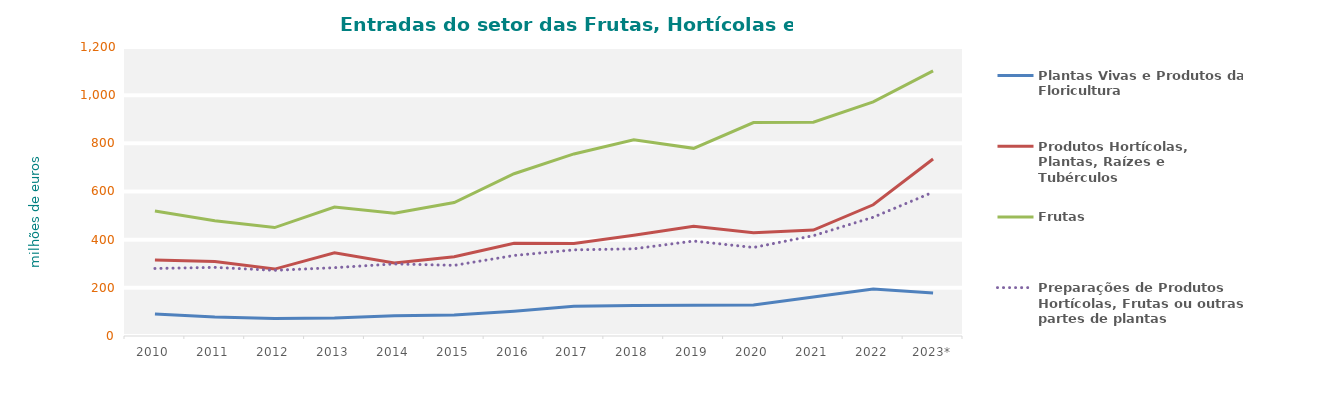
| Category | Plantas Vivas e Produtos da Floricultura | Produtos Hortícolas, Plantas, Raízes e Tubérculos  | Frutas | Preparações de Produtos Hortícolas, Frutas ou outras partes de plantas |
|---|---|---|---|---|
| 2010 | 91.697 | 315.21 | 518.932 | 280.342 |
| 2011 | 78.797 | 309.383 | 478.958 | 284.949 |
| 2012 | 72.61 | 277.849 | 450.238 | 272.697 |
| 2013 | 74.703 | 345.246 | 535.092 | 283.737 |
| 2014 | 83.902 | 303.305 | 509.634 | 299.198 |
| 2015 | 87.093 | 329.173 | 553.923 | 293.327 |
| 2016 | 103.182 | 384.765 | 673.769 | 334.369 |
| 2017 | 123.899 | 384.428 | 755.955 | 357.647 |
| 2018 | 126.586 | 418.729 | 814.572 | 361.967 |
| 2019 | 127.266 | 455.255 | 779.193 | 394.264 |
| 2020 | 128.381 | 428.985 | 886.341 | 367.606 |
| 2021 | 162.328 | 439.765 | 887.619 | 416.576 |
| 2022 | 195.368 | 544.945 | 972.097 | 493.12 |
| 2023* | 178.471 | 734.68 | 1101.138 | 597.26 |